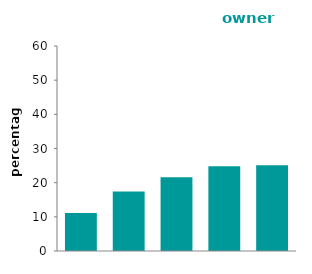
| Category | owner occupied |
|---|---|
| most deprived 20% | 11.144 |
| 2nd | 17.421 |
| 3rd | 21.57 |
| 4th | 24.789 |
| least deprived 20% | 25.076 |